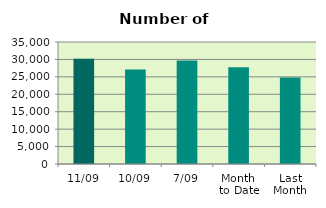
| Category | Series 0 |
|---|---|
| 11/09 | 30224 |
| 10/09 | 27088 |
| 7/09 | 29714 |
| Month 
to Date | 27765.714 |
| Last
Month | 24784.957 |